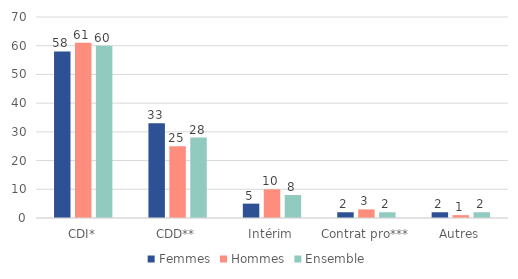
| Category | Femmes | Hommes | Ensemble |
|---|---|---|---|
| CDI* | 58 | 61 | 60 |
| CDD** | 33 | 25 | 28 |
| Intérim | 5 | 10 | 8 |
| Contrat pro*** | 2 | 3 | 2 |
| Autres | 2 | 1 | 2 |